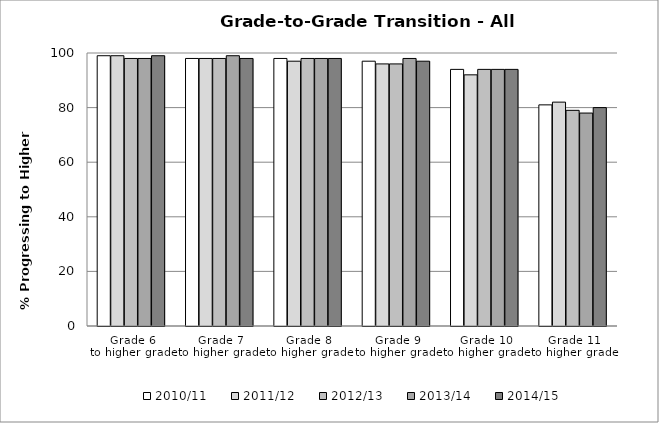
| Category | 2010/11 | 2011/12 | 2012/13 | 2013/14 | 2014/15 |
|---|---|---|---|---|---|
| Grade 6
to higher grade | 99 | 99 | 98 | 98 | 99 |
| Grade 7
to higher grade | 98 | 98 | 98 | 99 | 98 |
| Grade 8
to higher grade | 98 | 97 | 98 | 98 | 98 |
| Grade 9
to higher grade | 97 | 96 | 96 | 98 | 97 |
| Grade 10
to higher grade | 94 | 92 | 94 | 94 | 94 |
| Grade 11
to higher grade | 81 | 82 | 79 | 78 | 80 |